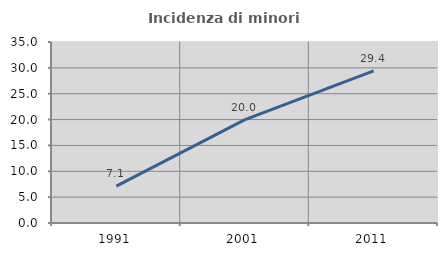
| Category | Incidenza di minori stranieri |
|---|---|
| 1991.0 | 7.143 |
| 2001.0 | 20 |
| 2011.0 | 29.412 |